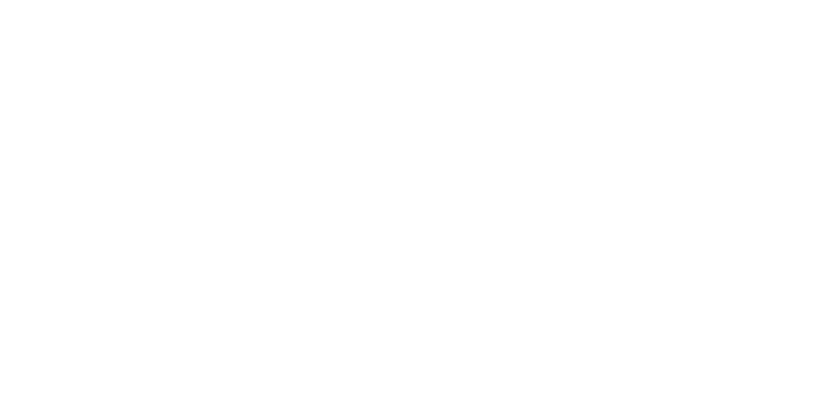
| Category | Total |
|---|---|
| Al Hodeidah | 74945 |
| Hajjah | 72685 |
| Marib | 51707 |
| Al Jawf | 14809 |
| Taiz | 14801 |
| Hadramawt | 8309 |
| Sadah | 7417 |
| Lahj | 4950 |
| Amran | 4830 |
| Abyan | 4181 |
| Sanaa | 3950 |
| Ad Dali | 3675 |
| Aden | 3625 |
| Ibb | 2773 |
| Dhamar | 2232 |
| Al Bayda | 1763 |
| Shabwah | 1041 |
| Al Mahwit | 681 |
| Al Maharah | 457 |
| Raymah | 451 |
| Sanaa City | 167 |
| Socotra | 15 |